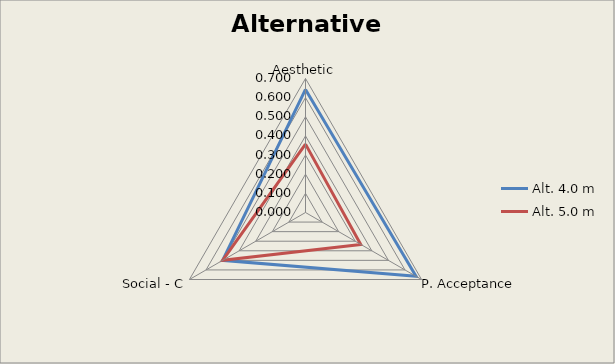
| Category | Alt. 4.0 m | Alt. 5.0 m |
|---|---|---|
| Aesthetic | 0.643 | 0.357 |
| P. Acceptance | 0.667 | 0.333 |
| Social - C | 0.5 | 0.5 |